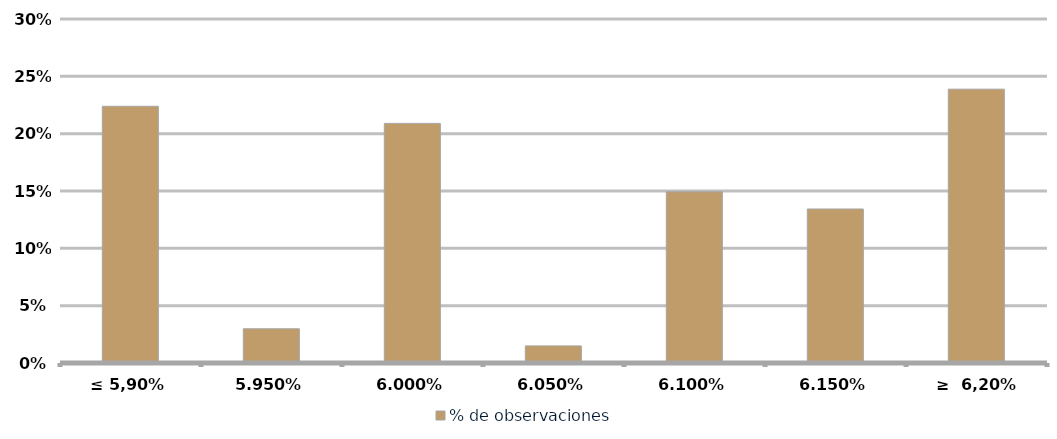
| Category | % de observaciones  |
|---|---|
| ≤ 5,90% | 0.224 |
| 5,95% | 0.03 |
| 6,00% | 0.209 |
| 6,05% | 0.015 |
| 6,10% | 0.149 |
| 6,15% | 0.134 |
| ≥  6,20% | 0.239 |